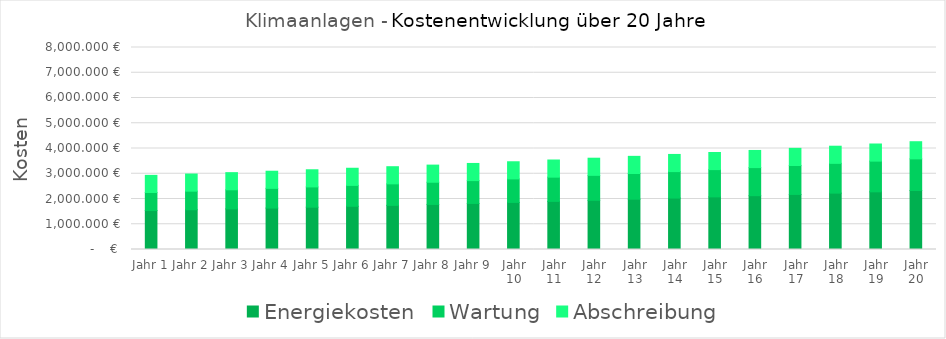
| Category | Energiekosten | Wartung | Abschreibung |
|---|---|---|---|
| Jahr 1 | 1542.977 | 714 | 678.844 |
| Jahr 2 | 1574.624 | 735.42 | 678.844 |
| Jahr 3 | 1607.22 | 757.483 | 678.844 |
| Jahr 4 | 1640.794 | 780.207 | 678.844 |
| Jahr 5 | 1675.375 | 803.613 | 678.844 |
| Jahr 6 | 1710.993 | 827.722 | 678.844 |
| Jahr 7 | 1747.681 | 852.553 | 678.844 |
| Jahr 8 | 1785.468 | 878.13 | 678.844 |
| Jahr 9 | 1824.39 | 904.474 | 678.844 |
| Jahr 10 | 1864.478 | 931.608 | 678.844 |
| Jahr 11 | 1905.77 | 959.556 | 678.844 |
| Jahr 12 | 1948.301 | 988.343 | 678.844 |
| Jahr 13 | 1992.107 | 1017.993 | 678.844 |
| Jahr 14 | 2037.227 | 1048.533 | 678.844 |
| Jahr 15 | 2083.701 | 1079.989 | 678.844 |
| Jahr 16 | 2131.57 | 1112.389 | 678.844 |
| Jahr 17 | 2180.874 | 1145.76 | 678.844 |
| Jahr 18 | 2231.658 | 1180.133 | 678.844 |
| Jahr 19 | 2283.965 | 1215.537 | 678.844 |
| Jahr 20 | 2337.841 | 1252.003 | 678.844 |